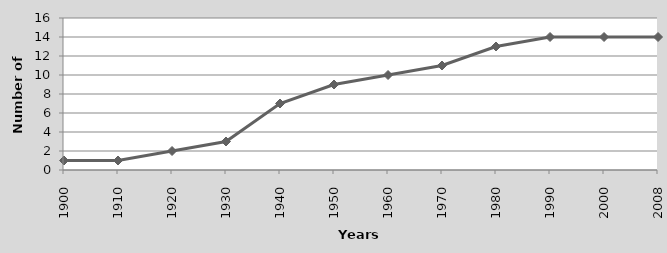
| Category | Agenda setting powers of presidents |
|---|---|
| 1900.0 | 1 |
| 1910.0 | 1 |
| 1920.0 | 2 |
| 1930.0 | 3 |
| 1940.0 | 7 |
| 1950.0 | 9 |
| 1960.0 | 10 |
| 1970.0 | 11 |
| 1980.0 | 13 |
| 1990.0 | 14 |
| 2000.0 | 14 |
| 2008.0 | 14 |